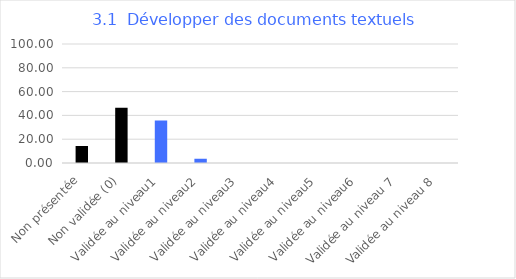
| Category | Series 0 |
|---|---|
| Non présentée | 14.286 |
| Non validée (0) | 46.429 |
| Validée au niveau1 | 35.714 |
| Validée au niveau2 | 3.571 |
| Validée au niveau3 | 0 |
| Validée au niveau4 | 0 |
| Validée au niveau5 | 0 |
| Validée au niveau6 | 0 |
| Validée au niveau 7 | 0 |
| Validée au niveau 8 | 0 |